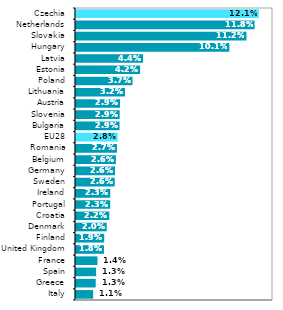
| Category | Series 0 |
|---|---|
| Italy | 0.011 |
| Greece | 0.013 |
| Spain | 0.013 |
| France | 0.014 |
| United Kingdom | 0.018 |
| Finland | 0.019 |
| Denmark | 0.02 |
| Croatia | 0.022 |
| Portugal | 0.023 |
| Ireland | 0.023 |
| Sweden | 0.026 |
| Germany | 0.026 |
| Belgium | 0.026 |
| Romania | 0.027 |
| EU28 | 0.028 |
| Bulgaria | 0.029 |
| Slovenia | 0.029 |
| Austria | 0.029 |
| Lithuania | 0.032 |
| Poland | 0.037 |
| Estonia | 0.042 |
| Latvia | 0.044 |
| Hungary | 0.101 |
| Slovakia | 0.112 |
| Netherlands | 0.118 |
| Czechia | 0.121 |